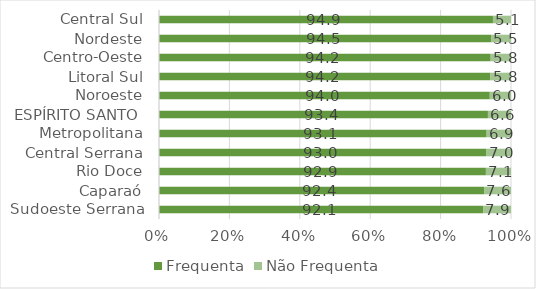
| Category | Frequenta | Não Frequenta |
|---|---|---|
| Sudoeste Serrana | 92.079 | 7.921 |
| Caparaó | 92.363 | 7.637 |
| Rio Doce | 92.87 | 7.13 |
| Central Serrana | 93.043 | 6.957 |
| Metropolitana | 93.084 | 6.916 |
| ESPÍRITO SANTO  | 93.448 | 6.552 |
| Noroeste | 93.974 | 6.026 |
| Litoral Sul | 94.183 | 5.817 |
| Centro-Oeste | 94.228 | 5.772 |
| Nordeste | 94.453 | 5.547 |
| Central Sul | 94.87 | 5.13 |